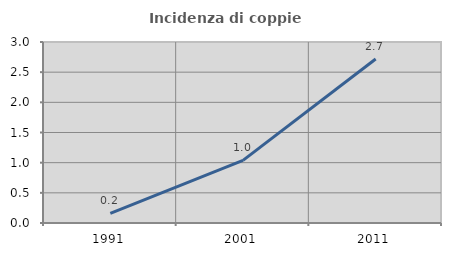
| Category | Incidenza di coppie miste |
|---|---|
| 1991.0 | 0.161 |
| 2001.0 | 1.037 |
| 2011.0 | 2.718 |